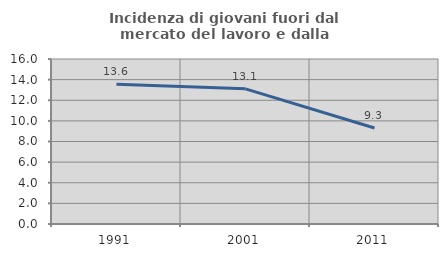
| Category | Incidenza di giovani fuori dal mercato del lavoro e dalla formazione  |
|---|---|
| 1991.0 | 13.56 |
| 2001.0 | 13.109 |
| 2011.0 | 9.309 |